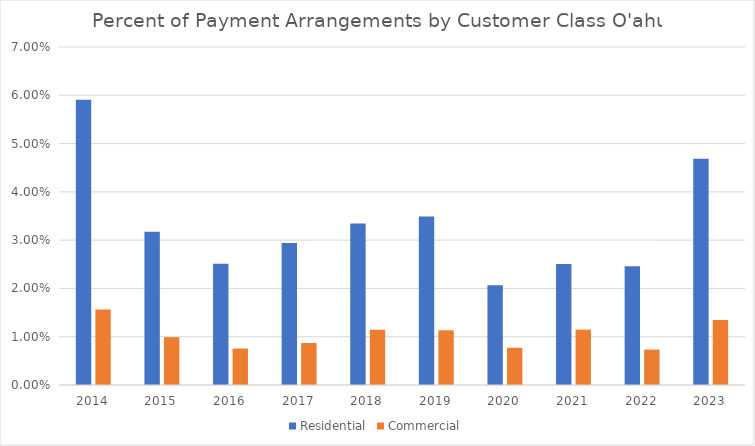
| Category | Residential | Commercial |
|---|---|---|
| 2014.0 | 0.059 | 0.016 |
| 2015.0 | 0.032 | 0.01 |
| 2016.0 | 0.025 | 0.008 |
| 2017.0 | 0.029 | 0.009 |
| 2018.0 | 0.033 | 0.011 |
| 2019.0 | 0.035 | 0.011 |
| 2020.0 | 0.021 | 0.008 |
| 2021.0 | 0.025 | 0.011 |
| 2022.0 | 0.025 | 0.007 |
| 2023.0 | 0.047 | 0.013 |